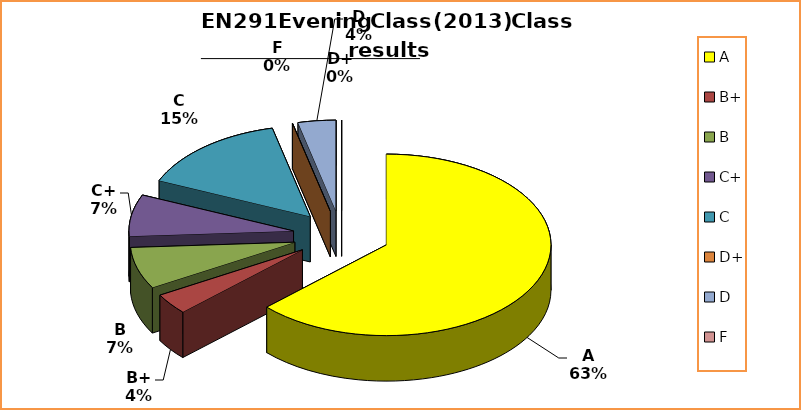
| Category | Series 0 |
|---|---|
| A | 17 |
| B+ | 1 |
| B | 2 |
| C+ | 2 |
| C | 4 |
| D+ | 0 |
| D | 1 |
| F | 0 |